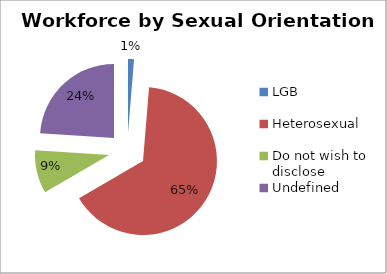
| Category | Series 0 |
|---|---|
| LGB | 73 |
| Heterosexual | 3639 |
| Do not wish to disclose | 525 |
| Undefined | 1336 |